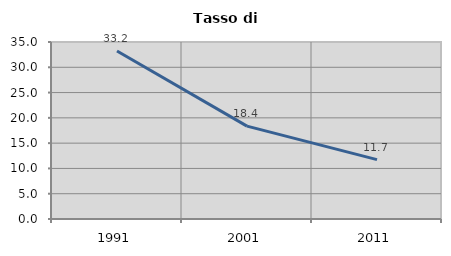
| Category | Tasso di disoccupazione   |
|---|---|
| 1991.0 | 33.217 |
| 2001.0 | 18.367 |
| 2011.0 | 11.742 |